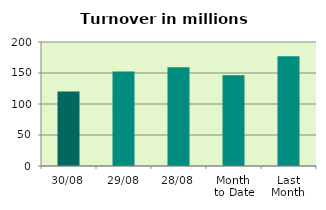
| Category | Series 0 |
|---|---|
| 30/08 | 120.028 |
| 29/08 | 152.362 |
| 28/08 | 159.145 |
| Month 
to Date | 146.514 |
| Last
Month | 177.022 |